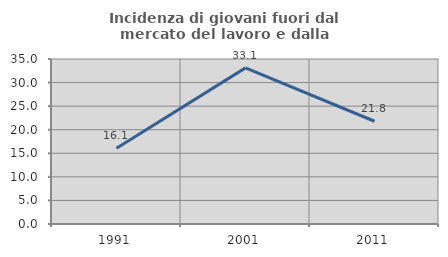
| Category | Incidenza di giovani fuori dal mercato del lavoro e dalla formazione  |
|---|---|
| 1991.0 | 16.063 |
| 2001.0 | 33.121 |
| 2011.0 | 21.795 |